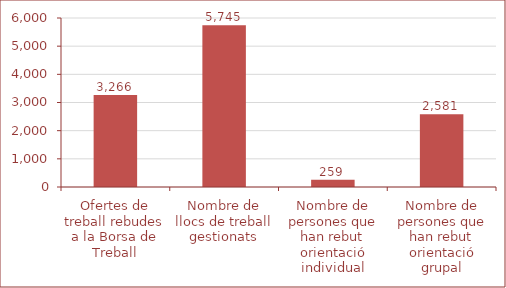
| Category | Series 0 |
|---|---|
| Ofertes de treball rebudes a la Borsa de Treball | 3266 |
| Nombre de llocs de treball gestionats | 5745 |
| Nombre de persones que han rebut orientació individual | 259 |
| Nombre de persones que han rebut orientació grupal | 2581 |